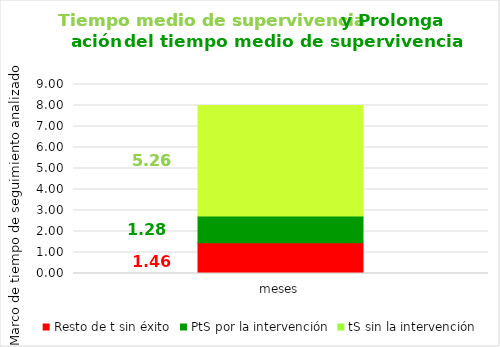
| Category | Resto de t sin éxito | PtS por la intervención | tS sin la intervención |
|---|---|---|---|
| meses | 1.459 | 1.278 | 5.262 |